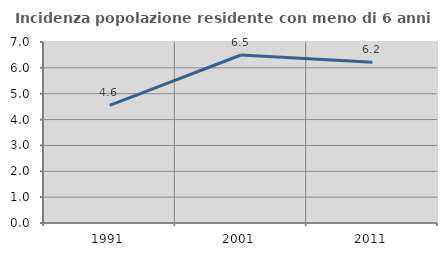
| Category | Incidenza popolazione residente con meno di 6 anni |
|---|---|
| 1991.0 | 4.552 |
| 2001.0 | 6.497 |
| 2011.0 | 6.221 |